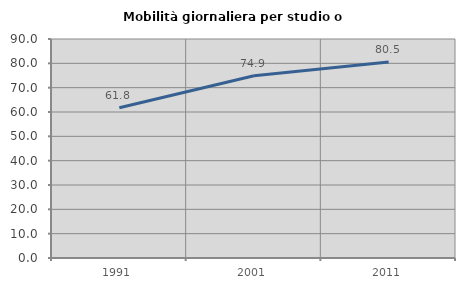
| Category | Mobilità giornaliera per studio o lavoro |
|---|---|
| 1991.0 | 61.753 |
| 2001.0 | 74.894 |
| 2011.0 | 80.531 |